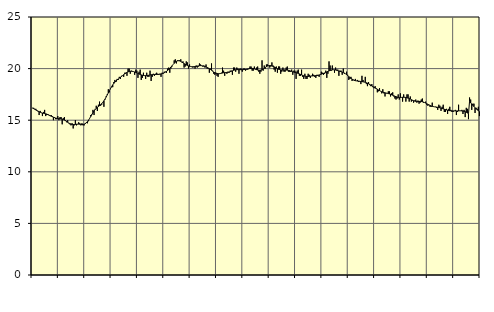
| Category | Piggar | Series 1 |
|---|---|---|
| nan | 16.2 | 16.16 |
| 87.0 | 16.2 | 16.12 |
| 87.0 | 16.1 | 16.06 |
| 87.0 | 16.1 | 15.99 |
| 87.0 | 15.9 | 15.93 |
| 87.0 | 15.9 | 15.87 |
| 87.0 | 15.5 | 15.82 |
| 87.0 | 15.9 | 15.77 |
| 87.0 | 15.7 | 15.72 |
| 87.0 | 15.4 | 15.69 |
| 87.0 | 15.8 | 15.67 |
| 87.0 | 16 | 15.64 |
| nan | 15.4 | 15.62 |
| 88.0 | 15.5 | 15.59 |
| 88.0 | 15.6 | 15.54 |
| 88.0 | 15.5 | 15.49 |
| 88.0 | 15.4 | 15.44 |
| 88.0 | 15.5 | 15.39 |
| 88.0 | 15.4 | 15.34 |
| 88.0 | 15 | 15.29 |
| 88.0 | 15.3 | 15.25 |
| 88.0 | 15.1 | 15.21 |
| 88.0 | 15.1 | 15.18 |
| 88.0 | 15.4 | 15.16 |
| nan | 15 | 15.15 |
| 89.0 | 15.3 | 15.13 |
| 89.0 | 15.3 | 15.11 |
| 89.0 | 14.6 | 15.09 |
| 89.0 | 15.2 | 15.06 |
| 89.0 | 15.3 | 15.01 |
| 89.0 | 15 | 14.95 |
| 89.0 | 14.8 | 14.88 |
| 89.0 | 15 | 14.8 |
| 89.0 | 14.7 | 14.73 |
| 89.0 | 14.6 | 14.67 |
| 89.0 | 14.5 | 14.63 |
| nan | 14.7 | 14.6 |
| 90.0 | 14.2 | 14.58 |
| 90.0 | 14.5 | 14.58 |
| 90.0 | 15 | 14.59 |
| 90.0 | 14.5 | 14.61 |
| 90.0 | 14.6 | 14.62 |
| 90.0 | 14.8 | 14.62 |
| 90.0 | 14.7 | 14.61 |
| 90.0 | 14.5 | 14.6 |
| 90.0 | 14.7 | 14.59 |
| 90.0 | 14.5 | 14.59 |
| 90.0 | 14.5 | 14.61 |
| nan | 14.7 | 14.66 |
| 91.0 | 14.8 | 14.75 |
| 91.0 | 14.7 | 14.87 |
| 91.0 | 14.9 | 15.01 |
| 91.0 | 15.2 | 15.18 |
| 91.0 | 15.5 | 15.36 |
| 91.0 | 15.6 | 15.55 |
| 91.0 | 16 | 15.73 |
| 91.0 | 15.5 | 15.89 |
| 91.0 | 16.1 | 16.03 |
| 91.0 | 16.4 | 16.15 |
| 91.0 | 15.9 | 16.25 |
| nan | 16.5 | 16.33 |
| 92.0 | 16.8 | 16.41 |
| 92.0 | 16.4 | 16.5 |
| 92.0 | 16.5 | 16.61 |
| 92.0 | 16.7 | 16.73 |
| 92.0 | 16.3 | 16.88 |
| 92.0 | 17 | 17.05 |
| 92.0 | 17.3 | 17.24 |
| 92.0 | 17.5 | 17.44 |
| 92.0 | 18 | 17.65 |
| 92.0 | 17.7 | 17.86 |
| 92.0 | 18.1 | 18.06 |
| nan | 18.2 | 18.25 |
| 93.0 | 18.2 | 18.42 |
| 93.0 | 18.7 | 18.56 |
| 93.0 | 18.9 | 18.69 |
| 93.0 | 18.7 | 18.8 |
| 93.0 | 19 | 18.9 |
| 93.0 | 18.9 | 18.99 |
| 93.0 | 19.2 | 19.08 |
| 93.0 | 19 | 19.16 |
| 93.0 | 19.3 | 19.24 |
| 93.0 | 19.3 | 19.32 |
| 93.0 | 19.2 | 19.41 |
| nan | 19.6 | 19.49 |
| 94.0 | 19.6 | 19.56 |
| 94.0 | 19.3 | 19.63 |
| 94.0 | 20 | 19.68 |
| 94.0 | 20 | 19.72 |
| 94.0 | 19.5 | 19.74 |
| 94.0 | 19.8 | 19.74 |
| 94.0 | 19.7 | 19.73 |
| 94.0 | 19.7 | 19.71 |
| 94.0 | 19.4 | 19.67 |
| 94.0 | 19.9 | 19.63 |
| 94.0 | 19.8 | 19.58 |
| nan | 19.1 | 19.53 |
| 95.0 | 19.7 | 19.48 |
| 95.0 | 19.9 | 19.43 |
| 95.0 | 18.9 | 19.39 |
| 95.0 | 19.1 | 19.36 |
| 95.0 | 19.6 | 19.33 |
| 95.0 | 19.3 | 19.32 |
| 95.0 | 19 | 19.32 |
| 95.0 | 19.6 | 19.32 |
| 95.0 | 19.2 | 19.34 |
| 95.0 | 19.2 | 19.36 |
| 95.0 | 19.8 | 19.38 |
| nan | 18.8 | 19.4 |
| 96.0 | 19.2 | 19.41 |
| 96.0 | 19.5 | 19.42 |
| 96.0 | 19.3 | 19.43 |
| 96.0 | 19.5 | 19.43 |
| 96.0 | 19.6 | 19.43 |
| 96.0 | 19.5 | 19.43 |
| 96.0 | 19.4 | 19.44 |
| 96.0 | 19.5 | 19.46 |
| 96.0 | 19.2 | 19.48 |
| 96.0 | 19.6 | 19.52 |
| 96.0 | 19.5 | 19.56 |
| nan | 19.7 | 19.6 |
| 97.0 | 19.7 | 19.66 |
| 97.0 | 19.6 | 19.73 |
| 97.0 | 20 | 19.82 |
| 97.0 | 20.1 | 19.92 |
| 97.0 | 19.6 | 20.03 |
| 97.0 | 20 | 20.15 |
| 97.0 | 20.2 | 20.27 |
| 97.0 | 20.4 | 20.4 |
| 97.0 | 20.8 | 20.52 |
| 97.0 | 20.9 | 20.62 |
| 97.0 | 20.5 | 20.7 |
| nan | 20.8 | 20.75 |
| 98.0 | 20.8 | 20.76 |
| 98.0 | 20.8 | 20.74 |
| 98.0 | 20.9 | 20.7 |
| 98.0 | 20.6 | 20.63 |
| 98.0 | 20.7 | 20.56 |
| 98.0 | 20.1 | 20.48 |
| 98.0 | 20.2 | 20.42 |
| 98.0 | 20.7 | 20.36 |
| 98.0 | 20.6 | 20.3 |
| 98.0 | 20 | 20.26 |
| 98.0 | 20.4 | 20.22 |
| nan | 20.2 | 20.2 |
| 99.0 | 20.2 | 20.18 |
| 99.0 | 20.1 | 20.18 |
| 99.0 | 20.2 | 20.18 |
| 99.0 | 20 | 20.19 |
| 99.0 | 20.3 | 20.21 |
| 99.0 | 20.1 | 20.24 |
| 99.0 | 20.2 | 20.26 |
| 99.0 | 20.5 | 20.28 |
| 99.0 | 20.4 | 20.29 |
| 99.0 | 20.3 | 20.28 |
| 99.0 | 20.2 | 20.26 |
| nan | 20.3 | 20.23 |
| 0.0 | 20.1 | 20.2 |
| 0.0 | 20.4 | 20.16 |
| 0.0 | 20 | 20.11 |
| 0.0 | 20 | 20.06 |
| 0.0 | 19.6 | 19.99 |
| 0.0 | 20 | 19.92 |
| 0.0 | 20.5 | 19.84 |
| 0.0 | 19.8 | 19.75 |
| 0.0 | 19.5 | 19.67 |
| 0.0 | 19.4 | 19.6 |
| 0.0 | 19.6 | 19.55 |
| nan | 19.3 | 19.52 |
| 1.0 | 19.2 | 19.5 |
| 1.0 | 19.5 | 19.51 |
| 1.0 | 19.5 | 19.52 |
| 1.0 | 19.6 | 19.55 |
| 1.0 | 20.1 | 19.57 |
| 1.0 | 19.8 | 19.6 |
| 1.0 | 19.3 | 19.61 |
| 1.0 | 19.6 | 19.62 |
| 1.0 | 19.5 | 19.63 |
| 1.0 | 19.7 | 19.64 |
| 1.0 | 19.6 | 19.66 |
| nan | 19.8 | 19.7 |
| 2.0 | 19.8 | 19.74 |
| 2.0 | 19.4 | 19.78 |
| 2.0 | 20.1 | 19.83 |
| 2.0 | 20.1 | 19.86 |
| 2.0 | 19.7 | 19.89 |
| 2.0 | 20.1 | 19.9 |
| 2.0 | 20 | 19.9 |
| 2.0 | 19.5 | 19.9 |
| 2.0 | 20 | 19.9 |
| 2.0 | 20 | 19.89 |
| 2.0 | 19.7 | 19.9 |
| nan | 20 | 19.9 |
| 3.0 | 20 | 19.91 |
| 3.0 | 19.8 | 19.93 |
| 3.0 | 19.9 | 19.95 |
| 3.0 | 19.9 | 19.97 |
| 3.0 | 20 | 19.99 |
| 3.0 | 20.2 | 20.01 |
| 3.0 | 20.2 | 20.02 |
| 3.0 | 19.8 | 20.02 |
| 3.0 | 19.8 | 20.01 |
| 3.0 | 20.2 | 19.98 |
| 3.0 | 19.9 | 19.94 |
| nan | 20.1 | 19.9 |
| 4.0 | 20.2 | 19.86 |
| 4.0 | 19.7 | 19.84 |
| 4.0 | 19.5 | 19.84 |
| 4.0 | 19.7 | 19.86 |
| 4.0 | 20.8 | 19.9 |
| 4.0 | 19.8 | 19.96 |
| 4.0 | 20.3 | 20.03 |
| 4.0 | 20 | 20.11 |
| 4.0 | 20.4 | 20.19 |
| 4.0 | 20.4 | 20.25 |
| 4.0 | 20.3 | 20.29 |
| nan | 20.1 | 20.3 |
| 5.0 | 20.2 | 20.29 |
| 5.0 | 20.6 | 20.26 |
| 5.0 | 20.3 | 20.22 |
| 5.0 | 19.9 | 20.17 |
| 5.0 | 19.7 | 20.11 |
| 5.0 | 20.2 | 20.05 |
| 5.0 | 19.6 | 19.99 |
| 5.0 | 20.2 | 19.94 |
| 5.0 | 20.2 | 19.91 |
| 5.0 | 19.5 | 19.88 |
| 5.0 | 19.7 | 19.87 |
| nan | 20.1 | 19.86 |
| 6.0 | 19.7 | 19.87 |
| 6.0 | 19.7 | 19.87 |
| 6.0 | 20.1 | 19.86 |
| 6.0 | 20.2 | 19.85 |
| 6.0 | 19.7 | 19.83 |
| 6.0 | 19.7 | 19.81 |
| 6.0 | 19.7 | 19.77 |
| 6.0 | 19.9 | 19.73 |
| 6.0 | 19.4 | 19.69 |
| 6.0 | 19.8 | 19.66 |
| 6.0 | 19.8 | 19.63 |
| nan | 19 | 19.6 |
| 7.0 | 19.8 | 19.57 |
| 7.0 | 19.9 | 19.53 |
| 7.0 | 19.3 | 19.49 |
| 7.0 | 19.3 | 19.44 |
| 7.0 | 19.9 | 19.39 |
| 7.0 | 19.2 | 19.34 |
| 7.0 | 19 | 19.3 |
| 7.0 | 19.5 | 19.27 |
| 7.0 | 19 | 19.25 |
| 7.0 | 19 | 19.24 |
| 7.0 | 19.5 | 19.24 |
| nan | 19.4 | 19.25 |
| 8.0 | 19.1 | 19.27 |
| 8.0 | 19.3 | 19.28 |
| 8.0 | 19.5 | 19.29 |
| 8.0 | 19.4 | 19.3 |
| 8.0 | 19.2 | 19.31 |
| 8.0 | 19.1 | 19.32 |
| 8.0 | 19.4 | 19.33 |
| 8.0 | 19.3 | 19.36 |
| 8.0 | 19.2 | 19.38 |
| 8.0 | 19.4 | 19.42 |
| 8.0 | 19.7 | 19.46 |
| nan | 19.6 | 19.5 |
| 9.0 | 19.4 | 19.54 |
| 9.0 | 19.5 | 19.58 |
| 9.0 | 19.8 | 19.63 |
| 9.0 | 19.1 | 19.68 |
| 9.0 | 19.5 | 19.73 |
| 9.0 | 20.7 | 19.78 |
| 9.0 | 20.3 | 19.82 |
| 9.0 | 19.8 | 19.86 |
| 9.0 | 20.3 | 19.88 |
| 9.0 | 19.9 | 19.89 |
| 9.0 | 19.6 | 19.88 |
| nan | 20.1 | 19.86 |
| 10.0 | 19.9 | 19.83 |
| 10.0 | 19.9 | 19.8 |
| 10.0 | 19.3 | 19.77 |
| 10.0 | 19.8 | 19.73 |
| 10.0 | 19.8 | 19.7 |
| 10.0 | 19.4 | 19.66 |
| 10.0 | 20 | 19.62 |
| 10.0 | 19.5 | 19.57 |
| 10.0 | 19.5 | 19.5 |
| 10.0 | 19.7 | 19.42 |
| 10.0 | 19.4 | 19.33 |
| nan | 18.9 | 19.23 |
| 11.0 | 19 | 19.14 |
| 11.0 | 19.2 | 19.06 |
| 11.0 | 18.8 | 18.98 |
| 11.0 | 18.9 | 18.92 |
| 11.0 | 18.8 | 18.87 |
| 11.0 | 19 | 18.83 |
| 11.0 | 18.8 | 18.81 |
| 11.0 | 18.9 | 18.79 |
| 11.0 | 18.7 | 18.78 |
| 11.0 | 18.8 | 18.77 |
| 11.0 | 18.5 | 18.75 |
| nan | 19.3 | 18.74 |
| 12.0 | 18.9 | 18.72 |
| 12.0 | 18.7 | 18.7 |
| 12.0 | 19.2 | 18.67 |
| 12.0 | 18.5 | 18.63 |
| 12.0 | 18.3 | 18.59 |
| 12.0 | 18.7 | 18.53 |
| 12.0 | 18.4 | 18.47 |
| 12.0 | 18.3 | 18.4 |
| 12.0 | 18.5 | 18.32 |
| 12.0 | 18.2 | 18.25 |
| 12.0 | 18.1 | 18.18 |
| nan | 18.3 | 18.12 |
| 13.0 | 18.1 | 18.06 |
| 13.0 | 17.7 | 18 |
| 13.0 | 17.8 | 17.93 |
| 13.0 | 18.1 | 17.87 |
| 13.0 | 17.8 | 17.81 |
| 13.0 | 17.6 | 17.76 |
| 13.0 | 18 | 17.71 |
| 13.0 | 17.6 | 17.68 |
| 13.0 | 17.3 | 17.65 |
| 13.0 | 17.6 | 17.63 |
| 13.0 | 17.6 | 17.61 |
| nan | 17.8 | 17.58 |
| 14.0 | 17.8 | 17.55 |
| 14.0 | 17.3 | 17.51 |
| 14.0 | 17.6 | 17.46 |
| 14.0 | 17.7 | 17.42 |
| 14.0 | 17.3 | 17.37 |
| 14.0 | 17.1 | 17.32 |
| 14.0 | 17 | 17.28 |
| 14.0 | 17.1 | 17.24 |
| 14.0 | 17.5 | 17.21 |
| 14.0 | 17 | 17.2 |
| 14.0 | 17.6 | 17.2 |
| nan | 17.2 | 17.21 |
| 15.0 | 16.8 | 17.22 |
| 15.0 | 17.5 | 17.22 |
| 15.0 | 17.2 | 17.22 |
| 15.0 | 16.8 | 17.2 |
| 15.0 | 17.5 | 17.17 |
| 15.0 | 17.5 | 17.14 |
| 15.0 | 16.8 | 17.1 |
| 15.0 | 17.3 | 17.05 |
| 15.0 | 16.8 | 16.99 |
| 15.0 | 16.9 | 16.94 |
| 15.0 | 16.7 | 16.89 |
| nan | 16.9 | 16.85 |
| 16.0 | 17 | 16.83 |
| 16.0 | 16.7 | 16.82 |
| 16.0 | 16.9 | 16.82 |
| 16.0 | 16.6 | 16.82 |
| 16.0 | 16.7 | 16.82 |
| 16.0 | 17 | 16.81 |
| 16.0 | 17.1 | 16.79 |
| 16.0 | 16.7 | 16.76 |
| 16.0 | 16.7 | 16.71 |
| 16.0 | 16.8 | 16.66 |
| 16.0 | 16.5 | 16.6 |
| nan | 16.4 | 16.54 |
| 17.0 | 16.5 | 16.48 |
| 17.0 | 16.3 | 16.43 |
| 17.0 | 16.3 | 16.38 |
| 17.0 | 16.7 | 16.34 |
| 17.0 | 16.3 | 16.32 |
| 17.0 | 16.3 | 16.3 |
| 17.0 | 16.3 | 16.28 |
| 17.0 | 16.2 | 16.27 |
| 17.0 | 16 | 16.25 |
| 17.0 | 16.5 | 16.23 |
| 17.0 | 16.4 | 16.2 |
| nan | 15.9 | 16.17 |
| 18.0 | 16.3 | 16.13 |
| 18.0 | 16.5 | 16.1 |
| 18.0 | 15.8 | 16.06 |
| 18.0 | 15.8 | 16.03 |
| 18.0 | 16.1 | 16 |
| 18.0 | 15.6 | 15.97 |
| 18.0 | 16.1 | 15.94 |
| 18.0 | 16.3 | 15.92 |
| 18.0 | 16 | 15.91 |
| 18.0 | 15.8 | 15.9 |
| 18.0 | 15.8 | 15.9 |
| nan | 15.9 | 15.9 |
| 19.0 | 16 | 15.9 |
| 19.0 | 15.5 | 15.9 |
| 19.0 | 15.8 | 15.9 |
| 19.0 | 16.5 | 15.9 |
| 19.0 | 15.9 | 15.91 |
| 19.0 | 15.9 | 15.91 |
| 19.0 | 16 | 15.9 |
| 19.0 | 15.6 | 15.89 |
| 19.0 | 16 | 15.86 |
| 19.0 | 15.3 | 15.82 |
| 19.0 | 16.2 | 15.77 |
| nan | 16.1 | 15.7 |
| 20.0 | 15.1 | 15.63 |
| 20.0 | 17.2 | 16.84 |
| 20.0 | 17 | 16.68 |
| 20.0 | 16 | 16.57 |
| 20.0 | 16.6 | 16.44 |
| 20.0 | 16.6 | 16.32 |
| 20.0 | 15.7 | 16.21 |
| 20.0 | 16.2 | 16.1 |
| 20.0 | 16.1 | 16.01 |
| 20.0 | 16.3 | 15.92 |
| 20.0 | 15.4 | 15.84 |